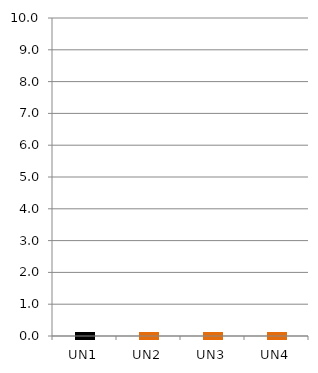
| Category | Series 0 |
|---|---|
| UN1 | 0 |
| UN2 | 0 |
| UN3 | 0 |
| UN4 | 0 |